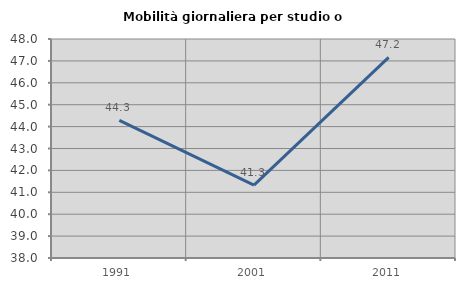
| Category | Mobilità giornaliera per studio o lavoro |
|---|---|
| 1991.0 | 44.287 |
| 2001.0 | 41.331 |
| 2011.0 | 47.16 |